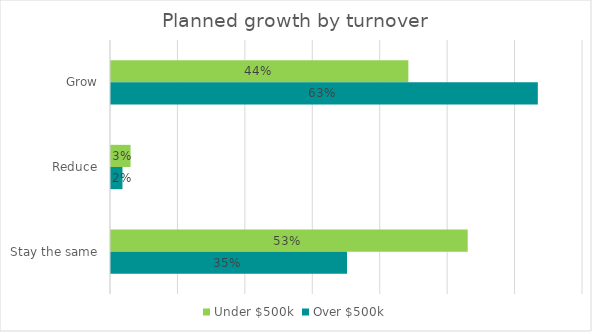
| Category | Under $500k | Over $500k |
|---|---|---|
| Grow | 44.1 | 63.3 |
| Reduce | 2.9 | 1.7 |
| Stay the same | 52.9 | 35 |